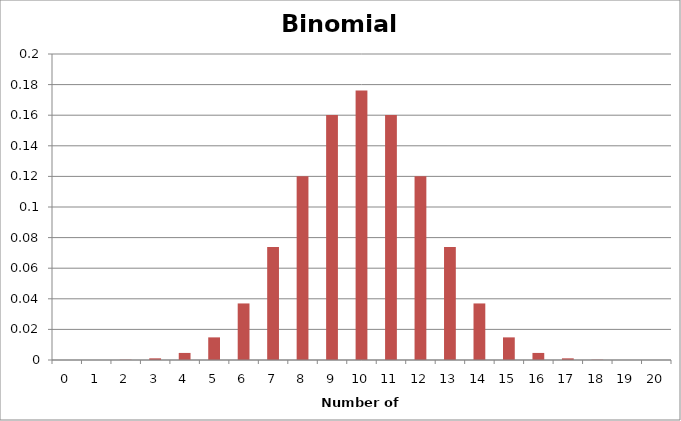
| Category | Binomial Probabilities |
|---|---|
| 0.0 | 0 |
| 1.0 | 0 |
| 2.0 | 0 |
| 3.0 | 0.001 |
| 4.0 | 0.005 |
| 5.0 | 0.015 |
| 6.0 | 0.037 |
| 7.0 | 0.074 |
| 8.0 | 0.12 |
| 9.0 | 0.16 |
| 10.0 | 0.176 |
| 11.0 | 0.16 |
| 12.0 | 0.12 |
| 13.0 | 0.074 |
| 14.0 | 0.037 |
| 15.0 | 0.015 |
| 16.0 | 0.005 |
| 17.0 | 0.001 |
| 18.0 | 0 |
| 19.0 | 0 |
| 20.0 | 0 |